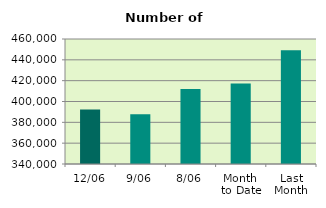
| Category | Series 0 |
|---|---|
| 12/06 | 392310 |
| 9/06 | 387670 |
| 8/06 | 412026 |
| Month 
to Date | 417329.5 |
| Last
Month | 449234.545 |